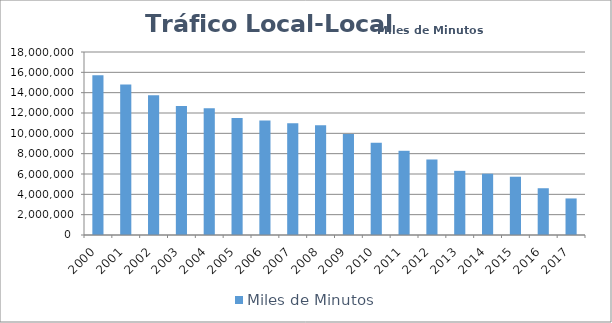
| Category | Miles de Minutos |
|---|---|
| 2000 | 15708021.692 |
| 2001 | 14792112.011 |
| 2002 | 13741512.578 |
| 2003 | 12697840.356 |
| 2004 | 12471681.103 |
| 2005 | 11497364.137 |
| 2006 | 11250082.402 |
| 2007 | 10981107.318 |
| 2008 | 10792163.023 |
| 2009 | 9925576.314 |
| 2010 | 9070767.124 |
| 2011 | 8283065.602 |
| 2012 | 7428037.584 |
| 2013 | 6310456.472 |
| 2014 | 6026527.532 |
| 2015 | 5731826.348 |
| 2016 | 4599625.362 |
| 2017 | 3595888.694 |